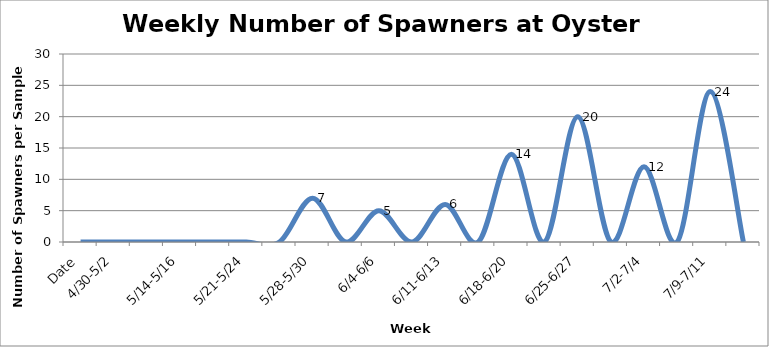
| Category | Series 0 |
|---|---|
| Date | 0 |
| 4/30-5/2 | 0 |
|  | 0 |
| 5/14-5/16 | 0 |
|  | 0 |
| 5/21-5/24 | 0 |
|  | 0 |
| 5/28-5/30 | 7 |
|  | 0 |
| 6/4-6/6 | 5 |
|  | 0 |
| 6/11-6/13 | 6 |
|  | 0 |
| 6/18-6/20 | 14 |
|  | 0 |
| 6/25-6/27 | 20 |
|  | 0 |
| 7/2-7/4 | 12 |
|  | 0 |
| 7/9-7/11 | 24 |